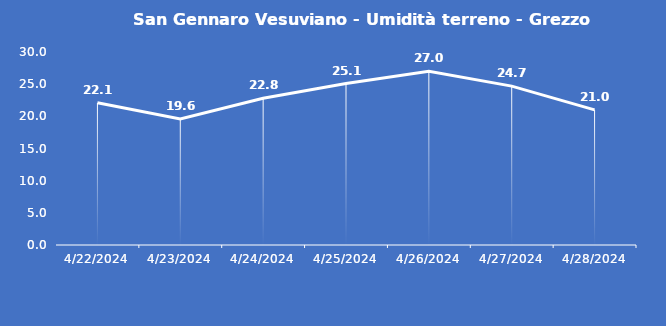
| Category | San Gennaro Vesuviano - Umidità terreno - Grezzo (%VWC) |
|---|---|
| 4/22/24 | 22.1 |
| 4/23/24 | 19.6 |
| 4/24/24 | 22.8 |
| 4/25/24 | 25.1 |
| 4/26/24 | 27 |
| 4/27/24 | 24.7 |
| 4/28/24 | 21 |